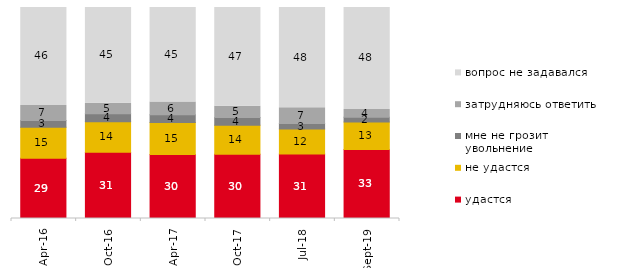
| Category | удастся | не удастся | мне не грозит увольнение | затрудняюсь ответить | вопрос не задавался |
|---|---|---|---|---|---|
| 2016-04-01 | 28.6 | 14.7 | 3.15 | 7.15 | 46.4 |
| 2016-10-01 | 31.45 | 14.45 | 3.8 | 4.9 | 45.4 |
| 2017-04-01 | 30.35 | 15.1 | 3.7 | 6.05 | 44.8 |
| 2017-10-01 | 30.4 | 13.8 | 3.7 | 5.3 | 46.8 |
| 2018-07-01 | 30.6 | 11.85 | 2.6 | 7.4 | 47.55 |
| 2019-09-01 | 32.723 | 12.97 | 2.327 | 3.663 | 48.317 |